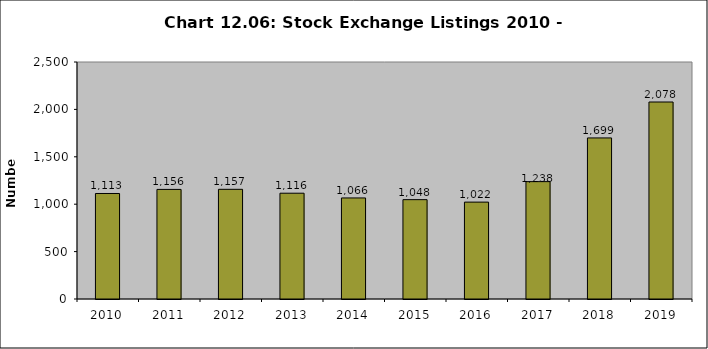
| Category | Series 0 |
|---|---|
| 2010.0 | 1113 |
| 2011.0 | 1156 |
| 2012.0 | 1157 |
| 2013.0 | 1116 |
| 2014.0 | 1066 |
| 2015.0 | 1048 |
| 2016.0 | 1022 |
| 2017.0 | 1238 |
| 2018.0 | 1699 |
| 2019.0 | 2078 |